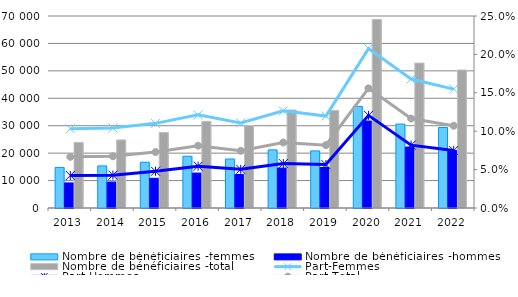
| Category | Nombre de bénéficiaires -femmes | Nombre de bénéficiaires -hommes | Nombre de bénéficiaires -total |
|---|---|---|---|
| 2013.0 | 14783 | 9141 | 23924 |
| 2014.0 | 15351 | 9465 | 24816 |
| 2015.0 | 16692 | 10830 | 27522 |
| 2016.0 | 18877 | 12727 | 31604 |
| 2017.0 | 17874 | 12217 | 30091 |
| 2018.0 | 21187 | 14551 | 35738 |
| 2019.0 | 20818 | 14774 | 35592 |
| 2020.0 | 37049 | 31698 | 68747 |
| 2021.0 | 30603 | 22219 | 52822 |
| 2022.0 | 29353 | 20961 | 50314 |